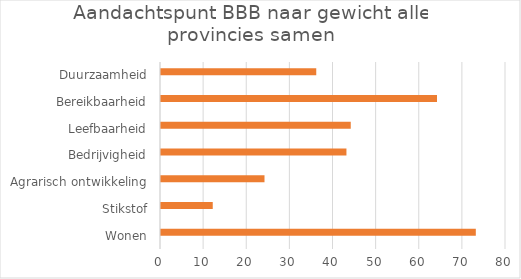
| Category | Series 0 | Series 1 |
|---|---|---|
| Wonen |  | 73 |
| Stikstof |  | 12 |
| Agrarisch ontwikkeling |  | 24 |
| Bedrijvigheid |  | 43 |
| Leefbaarheid |  | 44 |
| Bereikbaarheid |  | 64 |
| Duurzaamheid |  | 36 |